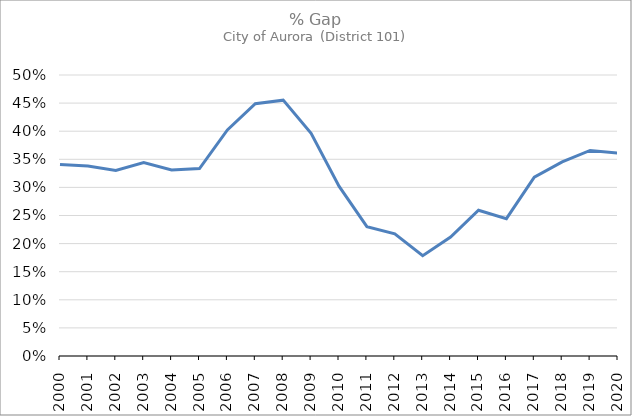
| Category | Series 0 |
|---|---|
| 2000.0 | 0.341 |
| 2001.0 | 0.338 |
| 2002.0 | 0.33 |
| 2003.0 | 0.344 |
| 2004.0 | 0.331 |
| 2005.0 | 0.333 |
| 2006.0 | 0.402 |
| 2007.0 | 0.449 |
| 2008.0 | 0.455 |
| 2009.0 | 0.396 |
| 2010.0 | 0.302 |
| 2011.0 | 0.23 |
| 2012.0 | 0.217 |
| 2013.0 | 0.178 |
| 2014.0 | 0.212 |
| 2015.0 | 0.259 |
| 2016.0 | 0.244 |
| 2017.0 | 0.318 |
| 2018.0 | 0.345 |
| 2019.0 | 0.366 |
| 2020.0 | 0.361 |